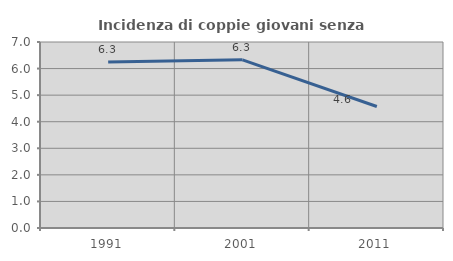
| Category | Incidenza di coppie giovani senza figli |
|---|---|
| 1991.0 | 6.25 |
| 2001.0 | 6.328 |
| 2011.0 | 4.572 |